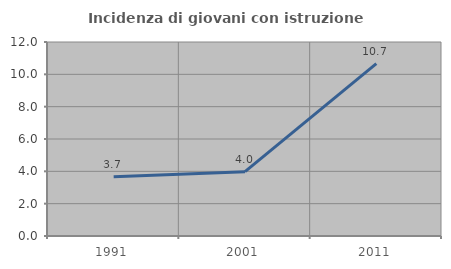
| Category | Incidenza di giovani con istruzione universitaria |
|---|---|
| 1991.0 | 3.665 |
| 2001.0 | 3.979 |
| 2011.0 | 10.667 |